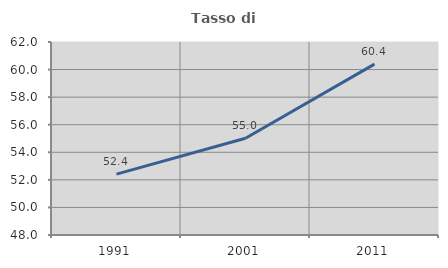
| Category | Tasso di occupazione   |
|---|---|
| 1991.0 | 52.418 |
| 2001.0 | 55.02 |
| 2011.0 | 60.393 |